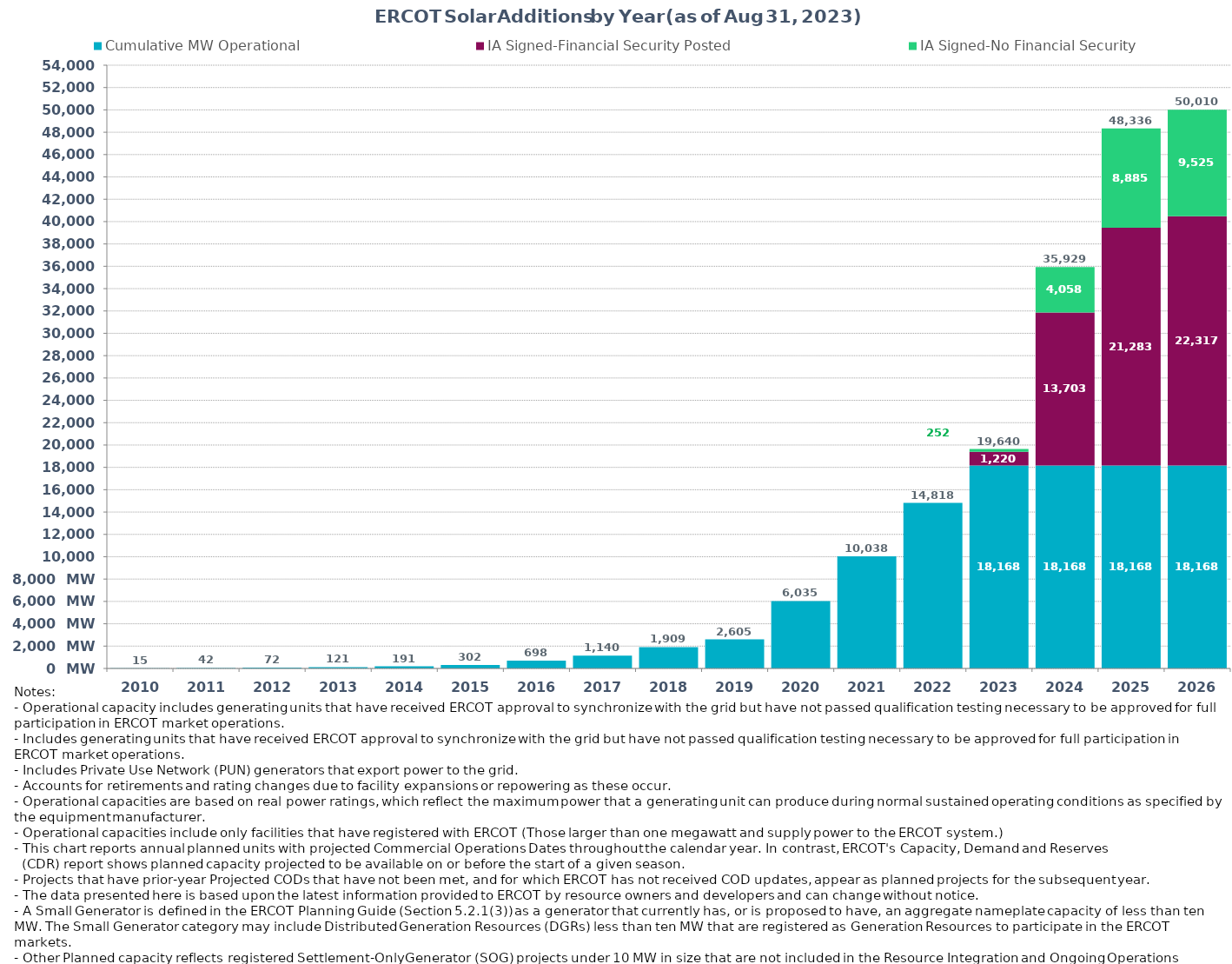
| Category | Cumulative MW Operational | IA Signed-Financial Security Posted  | IA Signed-No Financial Security  | Other Planned | Cumulative Installed and Planned |
|---|---|---|---|---|---|
| 2010.0 | 14.9 | 0 | 0 | 0 | 14.9 |
| 2011.0 | 41.6 | 0 | 0 | 0 | 41.6 |
| 2012.0 | 72 | 0 | 0 | 0 | 72 |
| 2013.0 | 121.18 | 0 | 0 | 0 | 121.18 |
| 2014.0 | 190.7 | 0 | 0 | 0 | 190.7 |
| 2015.0 | 301.71 | 0 | 0 | 0 | 301.71 |
| 2016.0 | 698.22 | 0 | 0 | 0 | 698.22 |
| 2017.0 | 1140.12 | 0 | 0 | 0 | 1140.12 |
| 2018.0 | 1909.16 | 0 | 0 | 0 | 1909.16 |
| 2019.0 | 2605.35 | 0 | 0 | 0 | 2605.35 |
| 2020.0 | 6034.64 | 0 | 0 | 0 | 6034.64 |
| 2021.0 | 10038.12 | 0 | 0 | 0 | 10038.12 |
| 2022.0 | 14818.22 | 0 | 0 | 0 | 14818.22 |
| 2023.0 | 18168.02 | 1220.41 | 252 | 0 | 19640.43 |
| 2024.0 | 18168.02 | 13703.47 | 4057.53 | 0 | 35929.02 |
| 2025.0 | 18168.02 | 21283.48 | 8884.62 | 0 | 48336.12 |
| 2026.0 | 18168.02 | 22317.16 | 9525.16 | 0 | 50010.34 |